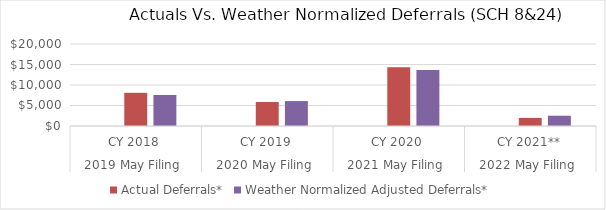
| Category | Residential: SCH 7 | Actual Deferrals* | Weather Normalized Adjusted Deferrals* |
|---|---|---|---|
| 0 |  | 8098.932 | 7561.939 |
| 1 |  | 5851.802 | 6081.318 |
| 2 |  | 14349.528 | 13675.838 |
| 3 |  | 1982.448 | 2507.453 |